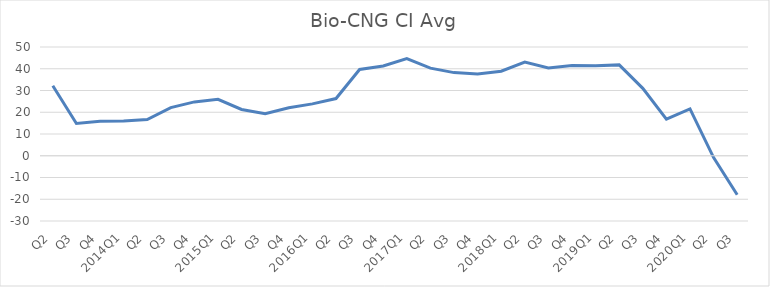
| Category | Bio-CNG CI Avg |
|---|---|
| Q2 | 32.21 |
| Q3 | 14.83 |
| Q4 | 15.88 |
| 2014Q1 | 16.02 |
| Q2 | 16.62 |
| Q3 | 22.11 |
| Q4 | 24.76 |
| 2015Q1 | 25.92 |
| Q2 | 21.27 |
| Q3 | 19.3 |
| Q4 | 22.06 |
| 2016Q1 | 23.84 |
| Q2 | 26.3 |
| Q3 | 39.66 |
| Q4 | 41.26 |
| 2017Q1 | 44.65 |
| Q2 | 40.27 |
| Q3 | 38.22 |
| Q4 | 37.55 |
| 2018Q1 | 38.88 |
| Q2 | 43.04 |
| Q3 | 40.39 |
| Q4 | 41.44 |
| 2019Q1 | 41.33 |
| Q2 | 41.77 |
| Q3 | 31 |
| Q4 | 16.84 |
| 2020Q1 | 21.53 |
| Q2 | -0.85 |
| Q3 | -17.95 |